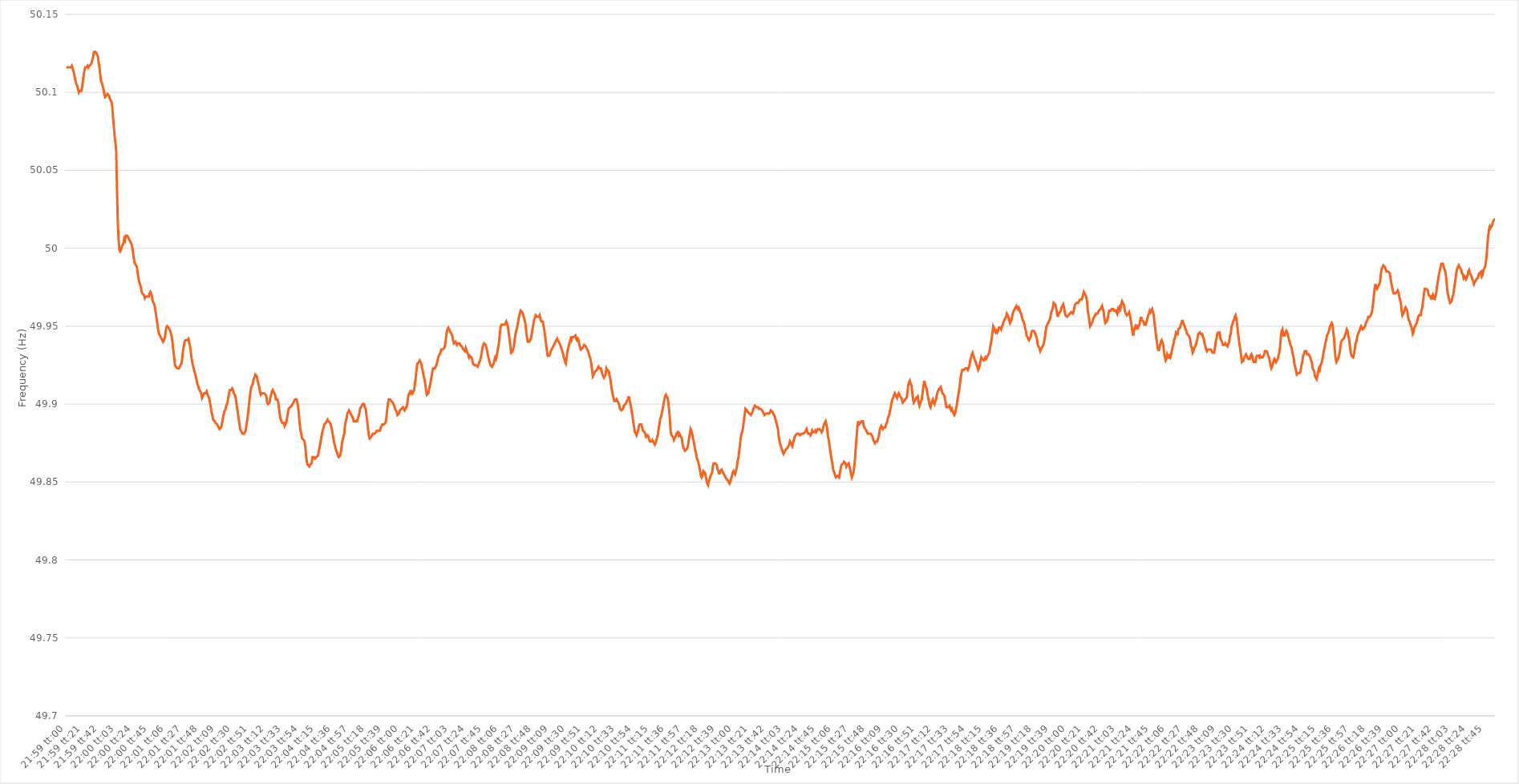
| Category | Series 0 |
|---|---|
| 0.9159722222222223 | 50.116 |
| 0.9159837962962962 | 50.116 |
| 0.9159953703703704 | 50.116 |
| 0.9160069444444444 | 50.116 |
| 0.9160185185185186 | 50.116 |
| 0.9160300925925925 | 50.116 |
| 0.9160416666666666 | 50.116 |
| 0.9160532407407408 | 50.117 |
| 0.9160648148148148 | 50.117 |
| 0.9160763888888889 | 50.114 |
| 0.9160879629629629 | 50.112 |
| 0.9160995370370371 | 50.109 |
| 0.9161111111111112 | 50.107 |
| 0.9161226851851851 | 50.105 |
| 0.9161342592592593 | 50.104 |
| 0.9161458333333333 | 50.102 |
| 0.9161574074074075 | 50.1 |
| 0.9161689814814814 | 50.101 |
| 0.9161805555555556 | 50.101 |
| 0.9161921296296297 | 50.101 |
| 0.9162037037037036 | 50.103 |
| 0.9162152777777778 | 50.107 |
| 0.9162268518518518 | 50.111 |
| 0.916238425925926 | 50.114 |
| 0.9162499999999999 | 50.116 |
| 0.916261574074074 | 50.116 |
| 0.9162731481481482 | 50.116 |
| 0.9162847222222222 | 50.117 |
| 0.9162962962962963 | 50.116 |
| 0.9163078703703703 | 50.117 |
| 0.9163194444444445 | 50.117 |
| 0.9163310185185186 | 50.118 |
| 0.9163425925925925 | 50.119 |
| 0.9163541666666667 | 50.121 |
| 0.9163657407407407 | 50.123 |
| 0.9163773148148149 | 50.126 |
| 0.9163888888888888 | 50.126 |
| 0.916400462962963 | 50.126 |
| 0.9164120370370371 | 50.126 |
| 0.916423611111111 | 50.124 |
| 0.9164351851851852 | 50.123 |
| 0.9164467592592592 | 50.119 |
| 0.9164583333333334 | 50.116 |
| 0.9164699074074073 | 50.111 |
| 0.9164814814814815 | 50.107 |
| 0.9164930555555556 | 50.106 |
| 0.9165046296296296 | 50.104 |
| 0.9165162037037037 | 50.102 |
| 0.9165277777777777 | 50.099 |
| 0.9165393518518519 | 50.097 |
| 0.916550925925926 | 50.097 |
| 0.9165625 | 50.098 |
| 0.9165740740740741 | 50.099 |
| 0.9165856481481481 | 50.099 |
| 0.9165972222222223 | 50.098 |
| 0.9166087962962962 | 50.096 |
| 0.9166203703703704 | 50.095 |
| 0.9166319444444445 | 50.094 |
| 0.9166435185185186 | 50.091 |
| 0.9166550925925926 | 50.084 |
| 0.9166666666666666 | 50.078 |
| 0.9166782407407408 | 50.072 |
| 0.9166898148148147 | 50.068 |
| 0.9167013888888889 | 50.062 |
| 0.916712962962963 | 50.037 |
| 0.916724537037037 | 50.017 |
| 0.9167361111111111 | 50.006 |
| 0.9167476851851851 | 49.999 |
| 0.9167592592592593 | 49.998 |
| 0.9167708333333334 | 49.999 |
| 0.9167824074074074 | 50.001 |
| 0.9167939814814815 | 50.002 |
| 0.9168055555555555 | 50.003 |
| 0.9168171296296297 | 50.006 |
| 0.9168287037037036 | 50.005 |
| 0.9168402777777778 | 50.008 |
| 0.9168518518518519 | 50.008 |
| 0.916863425925926 | 50.008 |
| 0.916875 | 50.007 |
| 0.916886574074074 | 50.007 |
| 0.9168981481481482 | 50.005 |
| 0.9169097222222221 | 50.004 |
| 0.9169212962962963 | 50.003 |
| 0.9169328703703704 | 50.001 |
| 0.9169444444444445 | 49.998 |
| 0.9169560185185185 | 49.994 |
| 0.9169675925925925 | 49.991 |
| 0.9169791666666667 | 49.99 |
| 0.9169907407407408 | 49.989 |
| 0.9170023148148148 | 49.988 |
| 0.9170138888888889 | 49.984 |
| 0.917025462962963 | 49.981 |
| 0.9170370370370371 | 49.978 |
| 0.917048611111111 | 49.977 |
| 0.9170601851851852 | 49.975 |
| 0.9170717592592593 | 49.972 |
| 0.9170833333333334 | 49.971 |
| 0.9170949074074074 | 49.971 |
| 0.9171064814814814 | 49.97 |
| 0.9171180555555556 | 49.968 |
| 0.9171296296296297 | 49.969 |
| 0.9171412037037037 | 49.969 |
| 0.9171527777777778 | 49.969 |
| 0.9171643518518519 | 49.969 |
| 0.9171759259259259 | 49.969 |
| 0.9171874999999999 | 49.971 |
| 0.9171990740740741 | 49.972 |
| 0.9172106481481482 | 49.971 |
| 0.9172222222222222 | 49.969 |
| 0.9172337962962963 | 49.966 |
| 0.9172453703703703 | 49.965 |
| 0.9172569444444445 | 49.964 |
| 0.9172685185185184 | 49.961 |
| 0.9172800925925926 | 49.958 |
| 0.9172916666666667 | 49.954 |
| 0.9173032407407408 | 49.951 |
| 0.9173148148148148 | 49.947 |
| 0.9173263888888888 | 49.945 |
| 0.917337962962963 | 49.944 |
| 0.9173495370370371 | 49.943 |
| 0.9173611111111111 | 49.943 |
| 0.9173726851851852 | 49.941 |
| 0.9173842592592593 | 49.94 |
| 0.9173958333333333 | 49.94 |
| 0.9174074074074073 | 49.942 |
| 0.9174189814814815 | 49.946 |
| 0.9174305555555556 | 49.949 |
| 0.9174421296296296 | 49.95 |
| 0.9174537037037037 | 49.95 |
| 0.9174652777777778 | 49.949 |
| 0.9174768518518519 | 49.948 |
| 0.9174884259259258 | 49.947 |
| 0.9175 | 49.945 |
| 0.9175115740740741 | 49.943 |
| 0.9175231481481482 | 49.939 |
| 0.9175347222222222 | 49.934 |
| 0.9175462962962962 | 49.93 |
| 0.9175578703703704 | 49.925 |
| 0.9175694444444445 | 49.924 |
| 0.9175810185185185 | 49.924 |
| 0.9175925925925926 | 49.923 |
| 0.9176041666666667 | 49.923 |
| 0.9176157407407407 | 49.923 |
| 0.9176273148148147 | 49.924 |
| 0.9176388888888889 | 49.924 |
| 0.917650462962963 | 49.926 |
| 0.917662037037037 | 49.929 |
| 0.9176736111111111 | 49.934 |
| 0.9176851851851852 | 49.937 |
| 0.9176967592592593 | 49.94 |
| 0.9177083333333332 | 49.941 |
| 0.9177199074074074 | 49.941 |
| 0.9177314814814815 | 49.941 |
| 0.9177430555555556 | 49.941 |
| 0.9177546296296296 | 49.942 |
| 0.9177662037037037 | 49.939 |
| 0.9177777777777778 | 49.937 |
| 0.917789351851852 | 49.933 |
| 0.9178009259259259 | 49.929 |
| 0.9178125 | 49.926 |
| 0.9178240740740741 | 49.924 |
| 0.9178356481481482 | 49.922 |
| 0.9178472222222221 | 49.92 |
| 0.9178587962962963 | 49.918 |
| 0.9178703703703704 | 49.916 |
| 0.9178819444444444 | 49.913 |
| 0.9178935185185185 | 49.912 |
| 0.9179050925925926 | 49.91 |
| 0.9179166666666667 | 49.909 |
| 0.9179282407407406 | 49.908 |
| 0.9179398148148148 | 49.907 |
| 0.9179513888888889 | 49.904 |
| 0.917962962962963 | 49.904 |
| 0.917974537037037 | 49.906 |
| 0.9179861111111111 | 49.907 |
| 0.9179976851851852 | 49.907 |
| 0.9180092592592594 | 49.907 |
| 0.9180208333333333 | 49.908 |
| 0.9180324074074074 | 49.906 |
| 0.9180439814814815 | 49.905 |
| 0.9180555555555556 | 49.904 |
| 0.9180671296296296 | 49.901 |
| 0.9180787037037037 | 49.898 |
| 0.9180902777777779 | 49.895 |
| 0.9181018518518518 | 49.893 |
| 0.9181134259259259 | 49.89 |
| 0.918125 | 49.89 |
| 0.9181365740740741 | 49.889 |
| 0.918148148148148 | 49.888 |
| 0.9181597222222222 | 49.888 |
| 0.9181712962962963 | 49.887 |
| 0.9181828703703704 | 49.886 |
| 0.9181944444444444 | 49.885 |
| 0.9182060185185185 | 49.884 |
| 0.9182175925925926 | 49.884 |
| 0.9182291666666668 | 49.885 |
| 0.9182407407407407 | 49.887 |
| 0.9182523148148148 | 49.89 |
| 0.9182638888888889 | 49.893 |
| 0.918275462962963 | 49.895 |
| 0.918287037037037 | 49.896 |
| 0.9182986111111111 | 49.898 |
| 0.9183101851851853 | 49.898 |
| 0.9183217592592593 | 49.901 |
| 0.9183333333333333 | 49.904 |
| 0.9183449074074074 | 49.907 |
| 0.9183564814814815 | 49.909 |
| 0.9183680555555555 | 49.909 |
| 0.9183796296296296 | 49.909 |
| 0.9183912037037038 | 49.91 |
| 0.9184027777777778 | 49.909 |
| 0.9184143518518518 | 49.907 |
| 0.9184259259259259 | 49.906 |
| 0.9184375 | 49.905 |
| 0.9184490740740742 | 49.902 |
| 0.9184606481481481 | 49.898 |
| 0.9184722222222222 | 49.895 |
| 0.9184837962962963 | 49.891 |
| 0.9184953703703704 | 49.888 |
| 0.9185069444444444 | 49.884 |
| 0.9185185185185185 | 49.883 |
| 0.9185300925925927 | 49.882 |
| 0.9185416666666667 | 49.881 |
| 0.9185532407407407 | 49.881 |
| 0.9185648148148148 | 49.881 |
| 0.9185763888888889 | 49.881 |
| 0.9185879629629629 | 49.883 |
| 0.918599537037037 | 49.887 |
| 0.9186111111111112 | 49.89 |
| 0.9186226851851852 | 49.894 |
| 0.9186342592592592 | 49.899 |
| 0.9186458333333333 | 49.904 |
| 0.9186574074074074 | 49.908 |
| 0.9186689814814816 | 49.911 |
| 0.9186805555555555 | 49.912 |
| 0.9186921296296297 | 49.913 |
| 0.9187037037037037 | 49.916 |
| 0.9187152777777778 | 49.917 |
| 0.9187268518518518 | 49.919 |
| 0.9187384259259259 | 49.919 |
| 0.9187500000000001 | 49.918 |
| 0.9187615740740741 | 49.915 |
| 0.9187731481481481 | 49.913 |
| 0.9187847222222222 | 49.911 |
| 0.9187962962962963 | 49.908 |
| 0.9188078703703703 | 49.906 |
| 0.9188194444444444 | 49.906 |
| 0.9188310185185186 | 49.907 |
| 0.9188425925925926 | 49.907 |
| 0.9188541666666666 | 49.907 |
| 0.9188657407407407 | 49.907 |
| 0.9188773148148148 | 49.906 |
| 0.918888888888889 | 49.905 |
| 0.9189004629629629 | 49.901 |
| 0.918912037037037 | 49.9 |
| 0.9189236111111111 | 49.9 |
| 0.9189351851851852 | 49.901 |
| 0.9189467592592592 | 49.904 |
| 0.9189583333333333 | 49.906 |
| 0.9189699074074075 | 49.908 |
| 0.9189814814814815 | 49.909 |
| 0.9189930555555555 | 49.908 |
| 0.9190046296296296 | 49.908 |
| 0.9190162037037037 | 49.906 |
| 0.9190277777777779 | 49.903 |
| 0.9190393518518518 | 49.903 |
| 0.919050925925926 | 49.903 |
| 0.9190625 | 49.901 |
| 0.919074074074074 | 49.897 |
| 0.9190856481481481 | 49.893 |
| 0.9190972222222222 | 49.89 |
| 0.9191087962962964 | 49.89 |
| 0.9191203703703703 | 49.888 |
| 0.9191319444444445 | 49.888 |
| 0.9191435185185185 | 49.888 |
| 0.9191550925925926 | 49.886 |
| 0.9191666666666666 | 49.886 |
| 0.9191782407407407 | 49.888 |
| 0.9191898148148149 | 49.891 |
| 0.9192013888888889 | 49.894 |
| 0.919212962962963 | 49.897 |
| 0.919224537037037 | 49.897 |
| 0.9192361111111111 | 49.898 |
| 0.9192476851851853 | 49.898 |
| 0.9192592592592592 | 49.899 |
| 0.9192708333333334 | 49.9 |
| 0.9192824074074074 | 49.901 |
| 0.9192939814814814 | 49.902 |
| 0.9193055555555555 | 49.903 |
| 0.9193171296296296 | 49.903 |
| 0.9193287037037038 | 49.903 |
| 0.9193402777777777 | 49.901 |
| 0.9193518518518519 | 49.898 |
| 0.9193634259259259 | 49.893 |
| 0.919375 | 49.887 |
| 0.919386574074074 | 49.883 |
| 0.9193981481481481 | 49.881 |
| 0.9194097222222223 | 49.878 |
| 0.9194212962962963 | 49.878 |
| 0.9194328703703704 | 49.877 |
| 0.9194444444444444 | 49.876 |
| 0.9194560185185185 | 49.873 |
| 0.9194675925925927 | 49.867 |
| 0.9194791666666666 | 49.863 |
| 0.9194907407407408 | 49.861 |
| 0.9195023148148148 | 49.861 |
| 0.9195138888888889 | 49.86 |
| 0.9195254629629629 | 49.861 |
| 0.919537037037037 | 49.861 |
| 0.9195486111111112 | 49.862 |
| 0.9195601851851851 | 49.866 |
| 0.9195717592592593 | 49.866 |
| 0.9195833333333333 | 49.866 |
| 0.9195949074074075 | 49.865 |
| 0.9196064814814814 | 49.865 |
| 0.9196180555555555 | 49.866 |
| 0.9196296296296297 | 49.866 |
| 0.9196412037037037 | 49.867 |
| 0.9196527777777778 | 49.87 |
| 0.9196643518518518 | 49.872 |
| 0.919675925925926 | 49.875 |
| 0.9196875000000001 | 49.878 |
| 0.919699074074074 | 49.881 |
| 0.9197106481481482 | 49.883 |
| 0.9197222222222222 | 49.885 |
| 0.9197337962962964 | 49.887 |
| 0.9197453703703703 | 49.887 |
| 0.9197569444444444 | 49.888 |
| 0.9197685185185186 | 49.889 |
| 0.9197800925925925 | 49.89 |
| 0.9197916666666667 | 49.889 |
| 0.9198032407407407 | 49.889 |
| 0.9198148148148149 | 49.888 |
| 0.9198263888888888 | 49.887 |
| 0.9198379629629629 | 49.885 |
| 0.9198495370370371 | 49.882 |
| 0.9198611111111111 | 49.879 |
| 0.9198726851851852 | 49.876 |
| 0.9198842592592592 | 49.874 |
| 0.9198958333333334 | 49.872 |
| 0.9199074074074075 | 49.87 |
| 0.9199189814814814 | 49.869 |
| 0.9199305555555556 | 49.867 |
| 0.9199421296296296 | 49.866 |
| 0.9199537037037038 | 49.866 |
| 0.9199652777777777 | 49.867 |
| 0.9199768518518519 | 49.87 |
| 0.919988425925926 | 49.874 |
| 0.9199999999999999 | 49.877 |
| 0.9200115740740741 | 49.879 |
| 0.9200231481481481 | 49.881 |
| 0.9200347222222223 | 49.886 |
| 0.9200462962962962 | 49.889 |
| 0.9200578703703703 | 49.891 |
| 0.9200694444444445 | 49.894 |
| 0.9200810185185185 | 49.895 |
| 0.9200925925925926 | 49.896 |
| 0.9201041666666666 | 49.896 |
| 0.9201157407407408 | 49.894 |
| 0.9201273148148149 | 49.893 |
| 0.9201388888888888 | 49.892 |
| 0.920150462962963 | 49.891 |
| 0.920162037037037 | 49.889 |
| 0.9201736111111112 | 49.889 |
| 0.9201851851851851 | 49.889 |
| 0.9201967592592593 | 49.889 |
| 0.9202083333333334 | 49.889 |
| 0.9202199074074073 | 49.889 |
| 0.9202314814814815 | 49.892 |
| 0.9202430555555555 | 49.894 |
| 0.9202546296296297 | 49.897 |
| 0.9202662037037036 | 49.898 |
| 0.9202777777777778 | 49.898 |
| 0.9202893518518519 | 49.9 |
| 0.9203009259259259 | 49.9 |
| 0.9203125 | 49.9 |
| 0.920324074074074 | 49.898 |
| 0.9203356481481482 | 49.897 |
| 0.9203472222222223 | 49.893 |
| 0.9203587962962962 | 49.889 |
| 0.9203703703703704 | 49.884 |
| 0.9203819444444444 | 49.88 |
| 0.9203935185185186 | 49.878 |
| 0.9204050925925925 | 49.878 |
| 0.9204166666666667 | 49.879 |
| 0.9204282407407408 | 49.88 |
| 0.9204398148148148 | 49.881 |
| 0.9204513888888889 | 49.881 |
| 0.9204629629629629 | 49.881 |
| 0.9204745370370371 | 49.881 |
| 0.920486111111111 | 49.882 |
| 0.9204976851851852 | 49.883 |
| 0.9205092592592593 | 49.883 |
| 0.9205208333333333 | 49.883 |
| 0.9205324074074074 | 49.883 |
| 0.9205439814814814 | 49.883 |
| 0.9205555555555556 | 49.885 |
| 0.9205671296296297 | 49.886 |
| 0.9205787037037036 | 49.887 |
| 0.9205902777777778 | 49.887 |
| 0.9206018518518518 | 49.887 |
| 0.920613425925926 | 49.887 |
| 0.9206249999999999 | 49.888 |
| 0.9206365740740741 | 49.891 |
| 0.9206481481481482 | 49.896 |
| 0.9206597222222223 | 49.9 |
| 0.9206712962962963 | 49.903 |
| 0.9206828703703703 | 49.903 |
| 0.9206944444444445 | 49.903 |
| 0.9207060185185184 | 49.902 |
| 0.9207175925925926 | 49.902 |
| 0.9207291666666667 | 49.901 |
| 0.9207407407407407 | 49.901 |
| 0.9207523148148148 | 49.899 |
| 0.9207638888888888 | 49.897 |
| 0.920775462962963 | 49.897 |
| 0.9207870370370371 | 49.895 |
| 0.920798611111111 | 49.893 |
| 0.9208101851851852 | 49.893 |
| 0.9208217592592592 | 49.894 |
| 0.9208333333333334 | 49.896 |
| 0.9208449074074073 | 49.896 |
| 0.9208564814814815 | 49.897 |
| 0.9208680555555556 | 49.897 |
| 0.9208796296296297 | 49.898 |
| 0.9208912037037037 | 49.897 |
| 0.9209027777777777 | 49.896 |
| 0.9209143518518519 | 49.897 |
| 0.920925925925926 | 49.897 |
| 0.9209375 | 49.899 |
| 0.9209490740740741 | 49.903 |
| 0.9209606481481482 | 49.906 |
| 0.9209722222222222 | 49.907 |
| 0.9209837962962962 | 49.908 |
| 0.9209953703703704 | 49.907 |
| 0.9210069444444445 | 49.908 |
| 0.9210185185185185 | 49.907 |
| 0.9210300925925926 | 49.908 |
| 0.9210416666666666 | 49.909 |
| 0.9210532407407408 | 49.913 |
| 0.9210648148148147 | 49.917 |
| 0.9210763888888889 | 49.922 |
| 0.921087962962963 | 49.926 |
| 0.9210995370370371 | 49.926 |
| 0.9211111111111111 | 49.927 |
| 0.9211226851851851 | 49.928 |
| 0.9211342592592593 | 49.927 |
| 0.9211458333333334 | 49.926 |
| 0.9211574074074074 | 49.923 |
| 0.9211689814814815 | 49.921 |
| 0.9211805555555556 | 49.918 |
| 0.9211921296296296 | 49.916 |
| 0.9212037037037036 | 49.913 |
| 0.9212152777777778 | 49.909 |
| 0.9212268518518519 | 49.906 |
| 0.9212384259259259 | 49.906 |
| 0.92125 | 49.907 |
| 0.921261574074074 | 49.91 |
| 0.9212731481481482 | 49.912 |
| 0.9212847222222221 | 49.915 |
| 0.9212962962962963 | 49.918 |
| 0.9213078703703704 | 49.921 |
| 0.9213194444444445 | 49.923 |
| 0.9213310185185185 | 49.923 |
| 0.9213425925925925 | 49.923 |
| 0.9213541666666667 | 49.924 |
| 0.9213657407407408 | 49.925 |
| 0.9213773148148148 | 49.927 |
| 0.9213888888888889 | 49.929 |
| 0.921400462962963 | 49.931 |
| 0.921412037037037 | 49.931 |
| 0.921423611111111 | 49.933 |
| 0.9214351851851852 | 49.935 |
| 0.9214467592592593 | 49.935 |
| 0.9214583333333333 | 49.935 |
| 0.9214699074074074 | 49.935 |
| 0.9214814814814815 | 49.936 |
| 0.9214930555555556 | 49.938 |
| 0.9215046296296295 | 49.942 |
| 0.9215162037037037 | 49.946 |
| 0.9215277777777778 | 49.948 |
| 0.9215393518518519 | 49.949 |
| 0.9215509259259259 | 49.948 |
| 0.9215625 | 49.947 |
| 0.9215740740740741 | 49.947 |
| 0.9215856481481483 | 49.945 |
| 0.9215972222222222 | 49.944 |
| 0.9216087962962963 | 49.941 |
| 0.9216203703703704 | 49.939 |
| 0.9216319444444445 | 49.939 |
| 0.9216435185185184 | 49.94 |
| 0.9216550925925926 | 49.939 |
| 0.9216666666666667 | 49.938 |
| 0.9216782407407407 | 49.939 |
| 0.9216898148148148 | 49.939 |
| 0.9217013888888889 | 49.939 |
| 0.921712962962963 | 49.938 |
| 0.9217245370370369 | 49.938 |
| 0.9217361111111111 | 49.937 |
| 0.9217476851851852 | 49.936 |
| 0.9217592592592593 | 49.935 |
| 0.9217708333333333 | 49.935 |
| 0.9217824074074074 | 49.934 |
| 0.9217939814814815 | 49.936 |
| 0.9218055555555557 | 49.936 |
| 0.9218171296296296 | 49.933 |
| 0.9218287037037037 | 49.932 |
| 0.9218402777777778 | 49.93 |
| 0.9218518518518519 | 49.931 |
| 0.9218634259259259 | 49.931 |
| 0.921875 | 49.93 |
| 0.9218865740740741 | 49.929 |
| 0.9218981481481481 | 49.926 |
| 0.9219097222222222 | 49.926 |
| 0.9219212962962963 | 49.925 |
| 0.9219328703703704 | 49.925 |
| 0.9219444444444443 | 49.925 |
| 0.9219560185185185 | 49.925 |
| 0.9219675925925926 | 49.924 |
| 0.9219791666666667 | 49.925 |
| 0.9219907407407407 | 49.927 |
| 0.9220023148148148 | 49.928 |
| 0.9220138888888889 | 49.93 |
| 0.9220254629629631 | 49.933 |
| 0.922037037037037 | 49.936 |
| 0.9220486111111111 | 49.938 |
| 0.9220601851851852 | 49.939 |
| 0.9220717592592593 | 49.939 |
| 0.9220833333333333 | 49.938 |
| 0.9220949074074074 | 49.936 |
| 0.9221064814814816 | 49.934 |
| 0.9221180555555555 | 49.931 |
| 0.9221296296296296 | 49.929 |
| 0.9221412037037037 | 49.927 |
| 0.9221527777777778 | 49.925 |
| 0.9221643518518517 | 49.925 |
| 0.9221759259259259 | 49.924 |
| 0.9221875 | 49.924 |
| 0.9221990740740741 | 49.926 |
| 0.9222106481481481 | 49.928 |
| 0.9222222222222222 | 49.93 |
| 0.9222337962962963 | 49.929 |
| 0.9222453703703705 | 49.931 |
| 0.9222569444444444 | 49.934 |
| 0.9222685185185185 | 49.937 |
| 0.9222800925925926 | 49.94 |
| 0.9222916666666667 | 49.946 |
| 0.9223032407407407 | 49.95 |
| 0.9223148148148148 | 49.951 |
| 0.922326388888889 | 49.951 |
| 0.922337962962963 | 49.951 |
| 0.922349537037037 | 49.951 |
| 0.9223611111111111 | 49.951 |
| 0.9223726851851852 | 49.952 |
| 0.9223842592592592 | 49.953 |
| 0.9223958333333333 | 49.953 |
| 0.9224074074074075 | 49.95 |
| 0.9224189814814815 | 49.946 |
| 0.9224305555555555 | 49.942 |
| 0.9224421296296296 | 49.938 |
| 0.9224537037037037 | 49.933 |
| 0.9224652777777779 | 49.933 |
| 0.9224768518518518 | 49.934 |
| 0.922488425925926 | 49.936 |
| 0.9225 | 49.939 |
| 0.9225115740740741 | 49.943 |
| 0.9225231481481481 | 49.946 |
| 0.9225347222222222 | 49.948 |
| 0.9225462962962964 | 49.95 |
| 0.9225578703703704 | 49.953 |
| 0.9225694444444444 | 49.956 |
| 0.9225810185185185 | 49.958 |
| 0.9225925925925926 | 49.96 |
| 0.9226041666666666 | 49.96 |
| 0.9226157407407407 | 49.959 |
| 0.9226273148148149 | 49.958 |
| 0.9226388888888889 | 49.956 |
| 0.9226504629629629 | 49.954 |
| 0.922662037037037 | 49.952 |
| 0.9226736111111111 | 49.947 |
| 0.9226851851851853 | 49.943 |
| 0.9226967592592592 | 49.94 |
| 0.9227083333333334 | 49.94 |
| 0.9227199074074074 | 49.94 |
| 0.9227314814814815 | 49.94 |
| 0.9227430555555555 | 49.942 |
| 0.9227546296296296 | 49.945 |
| 0.9227662037037038 | 49.948 |
| 0.9227777777777778 | 49.951 |
| 0.9227893518518518 | 49.954 |
| 0.9228009259259259 | 49.955 |
| 0.9228125 | 49.957 |
| 0.922824074074074 | 49.957 |
| 0.9228356481481481 | 49.956 |
| 0.9228472222222223 | 49.956 |
| 0.9228587962962963 | 49.956 |
| 0.9228703703703703 | 49.957 |
| 0.9228819444444444 | 49.955 |
| 0.9228935185185185 | 49.953 |
| 0.9229050925925927 | 49.953 |
| 0.9229166666666666 | 49.953 |
| 0.9229282407407408 | 49.95 |
| 0.9229398148148148 | 49.947 |
| 0.922951388888889 | 49.943 |
| 0.9229629629629629 | 49.939 |
| 0.922974537037037 | 49.935 |
| 0.9229861111111112 | 49.931 |
| 0.9229976851851852 | 49.931 |
| 0.9230092592592593 | 49.931 |
| 0.9230208333333333 | 49.932 |
| 0.9230324074074074 | 49.934 |
| 0.9230439814814816 | 49.934 |
| 0.9230555555555555 | 49.936 |
| 0.9230671296296297 | 49.937 |
| 0.9230787037037037 | 49.938 |
| 0.9230902777777777 | 49.939 |
| 0.9231018518518518 | 49.939 |
| 0.9231134259259259 | 49.941 |
| 0.9231250000000001 | 49.942 |
| 0.923136574074074 | 49.941 |
| 0.9231481481481482 | 49.94 |
| 0.9231597222222222 | 49.939 |
| 0.9231712962962964 | 49.938 |
| 0.9231828703703703 | 49.936 |
| 0.9231944444444444 | 49.935 |
| 0.9232060185185186 | 49.933 |
| 0.9232175925925926 | 49.931 |
| 0.9232291666666667 | 49.929 |
| 0.9232407407407407 | 49.927 |
| 0.9232523148148148 | 49.926 |
| 0.923263888888889 | 49.93 |
| 0.9232754629629629 | 49.934 |
| 0.9232870370370371 | 49.936 |
| 0.9232986111111111 | 49.938 |
| 0.9233101851851852 | 49.94 |
| 0.9233217592592592 | 49.942 |
| 0.9233333333333333 | 49.941 |
| 0.9233449074074075 | 49.943 |
| 0.9233564814814814 | 49.943 |
| 0.9233680555555556 | 49.943 |
| 0.9233796296296296 | 49.943 |
| 0.9233912037037038 | 49.944 |
| 0.9234027777777777 | 49.942 |
| 0.9234143518518518 | 49.941 |
| 0.923425925925926 | 49.942 |
| 0.9234375 | 49.941 |
| 0.9234490740740741 | 49.938 |
| 0.9234606481481481 | 49.936 |
| 0.9234722222222222 | 49.935 |
| 0.9234837962962964 | 49.935 |
| 0.9234953703703703 | 49.936 |
| 0.9235069444444445 | 49.936 |
| 0.9235185185185185 | 49.938 |
| 0.9235300925925927 | 49.938 |
| 0.9235416666666666 | 49.937 |
| 0.9235532407407407 | 49.937 |
| 0.9235648148148149 | 49.935 |
| 0.9235763888888888 | 49.934 |
| 0.923587962962963 | 49.932 |
| 0.923599537037037 | 49.932 |
| 0.9236111111111112 | 49.929 |
| 0.9236226851851851 | 49.926 |
| 0.9236342592592592 | 49.922 |
| 0.9236458333333334 | 49.918 |
| 0.9236574074074074 | 49.919 |
| 0.9236689814814815 | 49.919 |
| 0.9236805555555555 | 49.921 |
| 0.9236921296296297 | 49.921 |
| 0.9237037037037038 | 49.922 |
| 0.9237152777777777 | 49.923 |
| 0.9237268518518519 | 49.924 |
| 0.9237384259259259 | 49.923 |
| 0.9237500000000001 | 49.923 |
| 0.923761574074074 | 49.923 |
| 0.9237731481481481 | 49.921 |
| 0.9237847222222223 | 49.919 |
| 0.9237962962962962 | 49.918 |
| 0.9238078703703704 | 49.917 |
| 0.9238194444444444 | 49.918 |
| 0.9238310185185186 | 49.919 |
| 0.9238425925925925 | 49.923 |
| 0.9238541666666666 | 49.922 |
| 0.9238657407407408 | 49.922 |
| 0.9238773148148148 | 49.921 |
| 0.9238888888888889 | 49.918 |
| 0.9239004629629629 | 49.916 |
| 0.9239120370370371 | 49.912 |
| 0.9239236111111112 | 49.909 |
| 0.9239351851851851 | 49.906 |
| 0.9239467592592593 | 49.904 |
| 0.9239583333333333 | 49.902 |
| 0.9239699074074075 | 49.902 |
| 0.9239814814814814 | 49.902 |
| 0.9239930555555556 | 49.903 |
| 0.9240046296296297 | 49.903 |
| 0.9240162037037036 | 49.901 |
| 0.9240277777777778 | 49.9 |
| 0.9240393518518518 | 49.897 |
| 0.924050925925926 | 49.897 |
| 0.9240624999999999 | 49.896 |
| 0.924074074074074 | 49.896 |
| 0.9240856481481482 | 49.897 |
| 0.9240972222222222 | 49.899 |
| 0.9241087962962963 | 49.899 |
| 0.9241203703703703 | 49.9 |
| 0.9241319444444445 | 49.9 |
| 0.9241435185185186 | 49.902 |
| 0.9241550925925925 | 49.903 |
| 0.9241666666666667 | 49.905 |
| 0.9241782407407407 | 49.903 |
| 0.9241898148148149 | 49.901 |
| 0.9242013888888888 | 49.898 |
| 0.924212962962963 | 49.895 |
| 0.9242245370370371 | 49.892 |
| 0.9242361111111111 | 49.888 |
| 0.9242476851851852 | 49.885 |
| 0.9242592592592592 | 49.882 |
| 0.9242708333333334 | 49.881 |
| 0.9242824074074073 | 49.88 |
| 0.9242939814814815 | 49.88 |
| 0.9243055555555556 | 49.883 |
| 0.9243171296296296 | 49.886 |
| 0.9243287037037037 | 49.887 |
| 0.9243402777777777 | 49.887 |
| 0.9243518518518519 | 49.887 |
| 0.924363425925926 | 49.885 |
| 0.924375 | 49.883 |
| 0.9243865740740741 | 49.883 |
| 0.9243981481481481 | 49.882 |
| 0.9244097222222223 | 49.881 |
| 0.9244212962962962 | 49.879 |
| 0.9244328703703704 | 49.879 |
| 0.9244444444444445 | 49.88 |
| 0.9244560185185186 | 49.879 |
| 0.9244675925925926 | 49.877 |
| 0.9244791666666666 | 49.876 |
| 0.9244907407407408 | 49.876 |
| 0.9245023148148147 | 49.876 |
| 0.9245138888888889 | 49.877 |
| 0.924525462962963 | 49.876 |
| 0.924537037037037 | 49.875 |
| 0.9245486111111111 | 49.874 |
| 0.9245601851851851 | 49.875 |
| 0.9245717592592593 | 49.877 |
| 0.9245833333333334 | 49.879 |
| 0.9245949074074074 | 49.881 |
| 0.9246064814814815 | 49.885 |
| 0.9246180555555555 | 49.888 |
| 0.9246296296296297 | 49.891 |
| 0.9246412037037036 | 49.892 |
| 0.9246527777777778 | 49.895 |
| 0.9246643518518519 | 49.897 |
| 0.924675925925926 | 49.9 |
| 0.9246875 | 49.903 |
| 0.924699074074074 | 49.905 |
| 0.9247106481481482 | 49.906 |
| 0.9247222222222221 | 49.905 |
| 0.9247337962962963 | 49.904 |
| 0.9247453703703704 | 49.901 |
| 0.9247569444444445 | 49.896 |
| 0.9247685185185185 | 49.89 |
| 0.9247800925925925 | 49.882 |
| 0.9247916666666667 | 49.88 |
| 0.9248032407407408 | 49.88 |
| 0.9248148148148148 | 49.879 |
| 0.9248263888888889 | 49.877 |
| 0.924837962962963 | 49.877 |
| 0.9248495370370371 | 49.879 |
| 0.924861111111111 | 49.881 |
| 0.9248726851851852 | 49.881 |
| 0.9248842592592593 | 49.882 |
| 0.9248958333333334 | 49.88 |
| 0.9249074074074074 | 49.881 |
| 0.9249189814814814 | 49.88 |
| 0.9249305555555556 | 49.88 |
| 0.9249421296296297 | 49.878 |
| 0.9249537037037037 | 49.874 |
| 0.9249652777777778 | 49.872 |
| 0.9249768518518519 | 49.871 |
| 0.9249884259259259 | 49.87 |
| 0.9249999999999999 | 49.87 |
| 0.9250115740740741 | 49.871 |
| 0.9250231481481482 | 49.872 |
| 0.9250347222222222 | 49.874 |
| 0.9250462962962963 | 49.878 |
| 0.9250578703703703 | 49.881 |
| 0.9250694444444445 | 49.884 |
| 0.9250810185185184 | 49.883 |
| 0.9250925925925926 | 49.881 |
| 0.9251041666666667 | 49.878 |
| 0.9251157407407408 | 49.876 |
| 0.9251273148148148 | 49.873 |
| 0.9251388888888888 | 49.87 |
| 0.925150462962963 | 49.868 |
| 0.9251620370370371 | 49.865 |
| 0.9251736111111111 | 49.864 |
| 0.9251851851851852 | 49.862 |
| 0.9251967592592593 | 49.86 |
| 0.9252083333333333 | 49.857 |
| 0.9252199074074073 | 49.854 |
| 0.9252314814814815 | 49.853 |
| 0.9252430555555556 | 49.854 |
| 0.9252546296296296 | 49.857 |
| 0.9252662037037037 | 49.857 |
| 0.9252777777777778 | 49.856 |
| 0.9252893518518519 | 49.854 |
| 0.9253009259259258 | 49.851 |
| 0.9253125 | 49.849 |
| 0.9253240740740741 | 49.848 |
| 0.9253356481481482 | 49.851 |
| 0.9253472222222222 | 49.852 |
| 0.9253587962962962 | 49.854 |
| 0.9253703703703704 | 49.855 |
| 0.9253819444444445 | 49.856 |
| 0.9253935185185185 | 49.86 |
| 0.9254050925925926 | 49.862 |
| 0.9254166666666667 | 49.862 |
| 0.9254282407407407 | 49.862 |
| 0.9254398148148147 | 49.862 |
| 0.9254513888888889 | 49.861 |
| 0.925462962962963 | 49.858 |
| 0.925474537037037 | 49.857 |
| 0.9254861111111111 | 49.855 |
| 0.9254976851851852 | 49.857 |
| 0.9255092592592593 | 49.857 |
| 0.9255208333333332 | 49.858 |
| 0.9255324074074074 | 49.857 |
| 0.9255439814814815 | 49.857 |
| 0.9255555555555556 | 49.855 |
| 0.9255671296296296 | 49.854 |
| 0.9255787037037037 | 49.853 |
| 0.9255902777777778 | 49.852 |
| 0.925601851851852 | 49.852 |
| 0.9256134259259259 | 49.851 |
| 0.925625 | 49.851 |
| 0.9256365740740741 | 49.849 |
| 0.9256481481481482 | 49.85 |
| 0.9256597222222221 | 49.852 |
| 0.9256712962962963 | 49.854 |
| 0.9256828703703704 | 49.856 |
| 0.9256944444444444 | 49.857 |
| 0.9257060185185185 | 49.856 |
| 0.9257175925925926 | 49.855 |
| 0.9257291666666667 | 49.857 |
| 0.9257407407407406 | 49.859 |
| 0.9257523148148148 | 49.863 |
| 0.9257638888888889 | 49.865 |
| 0.925775462962963 | 49.869 |
| 0.925787037037037 | 49.873 |
| 0.9257986111111111 | 49.878 |
| 0.9258101851851852 | 49.881 |
| 0.9258217592592594 | 49.882 |
| 0.9258333333333333 | 49.885 |
| 0.9258449074074074 | 49.889 |
| 0.9258564814814815 | 49.893 |
| 0.9258680555555556 | 49.897 |
| 0.9258796296296296 | 49.897 |
| 0.9258912037037037 | 49.896 |
| 0.9259027777777779 | 49.895 |
| 0.9259143518518518 | 49.895 |
| 0.9259259259259259 | 49.894 |
| 0.9259375 | 49.894 |
| 0.9259490740740741 | 49.893 |
| 0.925960648148148 | 49.894 |
| 0.9259722222222222 | 49.895 |
| 0.9259837962962963 | 49.897 |
| 0.9259953703703704 | 49.898 |
| 0.9260069444444444 | 49.899 |
| 0.9260185185185185 | 49.899 |
| 0.9260300925925926 | 49.898 |
| 0.9260416666666668 | 49.898 |
| 0.9260532407407407 | 49.898 |
| 0.9260648148148148 | 49.897 |
| 0.9260763888888889 | 49.897 |
| 0.926087962962963 | 49.897 |
| 0.926099537037037 | 49.897 |
| 0.9261111111111111 | 49.896 |
| 0.9261226851851853 | 49.895 |
| 0.9261342592592593 | 49.894 |
| 0.9261458333333333 | 49.893 |
| 0.9261574074074074 | 49.893 |
| 0.9261689814814815 | 49.894 |
| 0.9261805555555555 | 49.894 |
| 0.9261921296296296 | 49.894 |
| 0.9262037037037038 | 49.894 |
| 0.9262152777777778 | 49.894 |
| 0.9262268518518518 | 49.895 |
| 0.9262384259259259 | 49.896 |
| 0.92625 | 49.896 |
| 0.9262615740740742 | 49.895 |
| 0.9262731481481481 | 49.894 |
| 0.9262847222222222 | 49.894 |
| 0.9262962962962963 | 49.892 |
| 0.9263078703703704 | 49.89 |
| 0.9263194444444444 | 49.888 |
| 0.9263310185185185 | 49.886 |
| 0.9263425925925927 | 49.884 |
| 0.9263541666666667 | 49.879 |
| 0.9263657407407407 | 49.876 |
| 0.9263773148148148 | 49.874 |
| 0.9263888888888889 | 49.874 |
| 0.9264004629629629 | 49.871 |
| 0.926412037037037 | 49.869 |
| 0.9264236111111112 | 49.868 |
| 0.9264351851851852 | 49.869 |
| 0.9264467592592592 | 49.87 |
| 0.9264583333333333 | 49.871 |
| 0.9264699074074074 | 49.871 |
| 0.9264814814814816 | 49.872 |
| 0.9264930555555555 | 49.873 |
| 0.9265046296296297 | 49.874 |
| 0.9265162037037037 | 49.876 |
| 0.9265277777777778 | 49.875 |
| 0.9265393518518518 | 49.874 |
| 0.9265509259259259 | 49.873 |
| 0.9265625000000001 | 49.875 |
| 0.9265740740740741 | 49.877 |
| 0.9265856481481481 | 49.879 |
| 0.9265972222222222 | 49.88 |
| 0.9266087962962963 | 49.88 |
| 0.9266203703703703 | 49.881 |
| 0.9266319444444444 | 49.881 |
| 0.9266435185185186 | 49.881 |
| 0.9266550925925926 | 49.881 |
| 0.9266666666666666 | 49.88 |
| 0.9266782407407407 | 49.88 |
| 0.9266898148148148 | 49.881 |
| 0.926701388888889 | 49.881 |
| 0.9267129629629629 | 49.881 |
| 0.926724537037037 | 49.881 |
| 0.9267361111111111 | 49.882 |
| 0.9267476851851852 | 49.883 |
| 0.9267592592592592 | 49.884 |
| 0.9267708333333333 | 49.882 |
| 0.9267824074074075 | 49.881 |
| 0.9267939814814815 | 49.881 |
| 0.9268055555555555 | 49.881 |
| 0.9268171296296296 | 49.88 |
| 0.9268287037037037 | 49.881 |
| 0.9268402777777779 | 49.883 |
| 0.9268518518518518 | 49.882 |
| 0.926863425925926 | 49.882 |
| 0.926875 | 49.882 |
| 0.926886574074074 | 49.883 |
| 0.9268981481481481 | 49.882 |
| 0.9269097222222222 | 49.883 |
| 0.9269212962962964 | 49.884 |
| 0.9269328703703703 | 49.884 |
| 0.9269444444444445 | 49.884 |
| 0.9269560185185185 | 49.884 |
| 0.9269675925925926 | 49.883 |
| 0.9269791666666666 | 49.882 |
| 0.9269907407407407 | 49.883 |
| 0.9270023148148149 | 49.885 |
| 0.9270138888888889 | 49.887 |
| 0.927025462962963 | 49.888 |
| 0.927037037037037 | 49.889 |
| 0.9270486111111111 | 49.887 |
| 0.9270601851851853 | 49.884 |
| 0.9270717592592592 | 49.879 |
| 0.9270833333333334 | 49.877 |
| 0.9270949074074074 | 49.873 |
| 0.9271064814814814 | 49.869 |
| 0.9271180555555555 | 49.866 |
| 0.9271296296296296 | 49.863 |
| 0.9271412037037038 | 49.86 |
| 0.9271527777777777 | 49.857 |
| 0.9271643518518519 | 49.856 |
| 0.9271759259259259 | 49.854 |
| 0.9271875 | 49.853 |
| 0.927199074074074 | 49.853 |
| 0.9272106481481481 | 49.854 |
| 0.9272222222222223 | 49.854 |
| 0.9272337962962963 | 49.853 |
| 0.9272453703703704 | 49.856 |
| 0.9272569444444444 | 49.859 |
| 0.9272685185185185 | 49.861 |
| 0.9272800925925927 | 49.861 |
| 0.9272916666666666 | 49.862 |
| 0.9273032407407408 | 49.863 |
| 0.9273148148148148 | 49.863 |
| 0.9273263888888889 | 49.862 |
| 0.9273379629629629 | 49.86 |
| 0.927349537037037 | 49.861 |
| 0.9273611111111112 | 49.861 |
| 0.9273726851851851 | 49.862 |
| 0.9273842592592593 | 49.86 |
| 0.9273958333333333 | 49.858 |
| 0.9274074074074075 | 49.855 |
| 0.9274189814814814 | 49.853 |
| 0.9274305555555555 | 49.853 |
| 0.9274421296296297 | 49.856 |
| 0.9274537037037037 | 49.86 |
| 0.9274652777777778 | 49.865 |
| 0.9274768518518518 | 49.873 |
| 0.927488425925926 | 49.879 |
| 0.9275000000000001 | 49.886 |
| 0.927511574074074 | 49.889 |
| 0.9275231481481482 | 49.887 |
| 0.9275347222222222 | 49.887 |
| 0.9275462962962964 | 49.888 |
| 0.9275578703703703 | 49.889 |
| 0.9275694444444444 | 49.889 |
| 0.9275810185185186 | 49.889 |
| 0.9275925925925925 | 49.886 |
| 0.9276041666666667 | 49.885 |
| 0.9276157407407407 | 49.885 |
| 0.9276273148148149 | 49.883 |
| 0.9276388888888888 | 49.882 |
| 0.9276504629629629 | 49.881 |
| 0.9276620370370371 | 49.881 |
| 0.9276736111111111 | 49.881 |
| 0.9276851851851852 | 49.881 |
| 0.9276967592592592 | 49.881 |
| 0.9277083333333334 | 49.88 |
| 0.9277199074074075 | 49.879 |
| 0.9277314814814814 | 49.877 |
| 0.9277430555555556 | 49.877 |
| 0.9277546296296296 | 49.875 |
| 0.9277662037037038 | 49.876 |
| 0.9277777777777777 | 49.876 |
| 0.9277893518518519 | 49.876 |
| 0.927800925925926 | 49.878 |
| 0.9278124999999999 | 49.88 |
| 0.9278240740740741 | 49.883 |
| 0.9278356481481481 | 49.885 |
| 0.9278472222222223 | 49.886 |
| 0.9278587962962962 | 49.885 |
| 0.9278703703703703 | 49.884 |
| 0.9278819444444445 | 49.885 |
| 0.9278935185185185 | 49.885 |
| 0.9279050925925926 | 49.885 |
| 0.9279166666666666 | 49.887 |
| 0.9279282407407408 | 49.888 |
| 0.9279398148148149 | 49.89 |
| 0.9279513888888888 | 49.892 |
| 0.927962962962963 | 49.893 |
| 0.927974537037037 | 49.896 |
| 0.9279861111111112 | 49.898 |
| 0.9279976851851851 | 49.901 |
| 0.9280092592592593 | 49.903 |
| 0.9280208333333334 | 49.904 |
| 0.9280324074074073 | 49.904 |
| 0.9280439814814815 | 49.907 |
| 0.9280555555555555 | 49.906 |
| 0.9280671296296297 | 49.905 |
| 0.9280787037037036 | 49.904 |
| 0.9280902777777778 | 49.906 |
| 0.9281018518518519 | 49.907 |
| 0.9281134259259259 | 49.906 |
| 0.928125 | 49.906 |
| 0.928136574074074 | 49.904 |
| 0.9281481481481482 | 49.903 |
| 0.9281597222222223 | 49.901 |
| 0.9281712962962962 | 49.901 |
| 0.9281828703703704 | 49.902 |
| 0.9281944444444444 | 49.903 |
| 0.9282060185185186 | 49.903 |
| 0.9282175925925925 | 49.904 |
| 0.9282291666666667 | 49.908 |
| 0.9282407407407408 | 49.912 |
| 0.9282523148148148 | 49.914 |
| 0.9282638888888889 | 49.915 |
| 0.9282754629629629 | 49.913 |
| 0.9282870370370371 | 49.912 |
| 0.928298611111111 | 49.908 |
| 0.9283101851851852 | 49.903 |
| 0.9283217592592593 | 49.901 |
| 0.9283333333333333 | 49.902 |
| 0.9283449074074074 | 49.902 |
| 0.9283564814814814 | 49.904 |
| 0.9283680555555556 | 49.904 |
| 0.9283796296296297 | 49.905 |
| 0.9283912037037036 | 49.901 |
| 0.9284027777777778 | 49.899 |
| 0.9284143518518518 | 49.899 |
| 0.928425925925926 | 49.902 |
| 0.9284374999999999 | 49.903 |
| 0.9284490740740741 | 49.907 |
| 0.9284606481481482 | 49.911 |
| 0.9284722222222223 | 49.915 |
| 0.9284837962962963 | 49.913 |
| 0.9284953703703703 | 49.913 |
| 0.9285069444444445 | 49.91 |
| 0.9285185185185184 | 49.907 |
| 0.9285300925925926 | 49.904 |
| 0.9285416666666667 | 49.902 |
| 0.9285532407407407 | 49.899 |
| 0.9285648148148148 | 49.898 |
| 0.9285763888888888 | 49.9 |
| 0.928587962962963 | 49.902 |
| 0.9285995370370371 | 49.903 |
| 0.928611111111111 | 49.901 |
| 0.9286226851851852 | 49.9 |
| 0.9286342592592592 | 49.902 |
| 0.9286458333333334 | 49.903 |
| 0.9286574074074073 | 49.906 |
| 0.9286689814814815 | 49.908 |
| 0.9286805555555556 | 49.909 |
| 0.9286921296296297 | 49.91 |
| 0.9287037037037037 | 49.91 |
| 0.9287152777777777 | 49.911 |
| 0.9287268518518519 | 49.909 |
| 0.928738425925926 | 49.907 |
| 0.92875 | 49.907 |
| 0.9287615740740741 | 49.906 |
| 0.9287731481481482 | 49.904 |
| 0.9287847222222222 | 49.901 |
| 0.9287962962962962 | 49.898 |
| 0.9288078703703704 | 49.898 |
| 0.9288194444444445 | 49.898 |
| 0.9288310185185185 | 49.898 |
| 0.9288425925925926 | 49.899 |
| 0.9288541666666666 | 49.897 |
| 0.9288657407407408 | 49.896 |
| 0.9288773148148147 | 49.897 |
| 0.9288888888888889 | 49.897 |
| 0.928900462962963 | 49.894 |
| 0.9289120370370371 | 49.893 |
| 0.9289236111111111 | 49.894 |
| 0.9289351851851851 | 49.897 |
| 0.9289467592592593 | 49.899 |
| 0.9289583333333334 | 49.903 |
| 0.9289699074074074 | 49.906 |
| 0.9289814814814815 | 49.909 |
| 0.9289930555555556 | 49.913 |
| 0.9290046296296296 | 49.917 |
| 0.9290162037037036 | 49.92 |
| 0.9290277777777778 | 49.922 |
| 0.9290393518518519 | 49.922 |
| 0.9290509259259259 | 49.922 |
| 0.9290625 | 49.922 |
| 0.929074074074074 | 49.923 |
| 0.9290856481481482 | 49.923 |
| 0.9290972222222221 | 49.923 |
| 0.9291087962962963 | 49.922 |
| 0.9291203703703704 | 49.923 |
| 0.9291319444444445 | 49.925 |
| 0.9291435185185185 | 49.928 |
| 0.9291550925925925 | 49.93 |
| 0.9291666666666667 | 49.932 |
| 0.9291782407407408 | 49.933 |
| 0.9291898148148148 | 49.931 |
| 0.9292013888888889 | 49.931 |
| 0.929212962962963 | 49.928 |
| 0.929224537037037 | 49.927 |
| 0.929236111111111 | 49.925 |
| 0.9292476851851852 | 49.924 |
| 0.9292592592592593 | 49.922 |
| 0.9292708333333333 | 49.923 |
| 0.9292824074074074 | 49.925 |
| 0.9292939814814815 | 49.928 |
| 0.9293055555555556 | 49.93 |
| 0.9293171296296295 | 49.929 |
| 0.9293287037037037 | 49.929 |
| 0.9293402777777778 | 49.928 |
| 0.9293518518518519 | 49.929 |
| 0.9293634259259259 | 49.93 |
| 0.929375 | 49.929 |
| 0.9293865740740741 | 49.93 |
| 0.9293981481481483 | 49.931 |
| 0.9294097222222222 | 49.932 |
| 0.9294212962962963 | 49.933 |
| 0.9294328703703704 | 49.936 |
| 0.9294444444444444 | 49.939 |
| 0.9294560185185184 | 49.942 |
| 0.9294675925925926 | 49.946 |
| 0.9294791666666667 | 49.95 |
| 0.9294907407407407 | 49.949 |
| 0.9295023148148148 | 49.947 |
| 0.9295138888888889 | 49.946 |
| 0.929525462962963 | 49.947 |
| 0.9295370370370369 | 49.946 |
| 0.9295486111111111 | 49.947 |
| 0.9295601851851852 | 49.949 |
| 0.9295717592592593 | 49.949 |
| 0.9295833333333333 | 49.949 |
| 0.9295949074074074 | 49.948 |
| 0.9296064814814815 | 49.95 |
| 0.9296180555555557 | 49.951 |
| 0.9296296296296296 | 49.953 |
| 0.9296412037037037 | 49.954 |
| 0.9296527777777778 | 49.954 |
| 0.9296643518518519 | 49.956 |
| 0.9296759259259259 | 49.958 |
| 0.9296875 | 49.958 |
| 0.9296990740740741 | 49.956 |
| 0.9297106481481481 | 49.954 |
| 0.9297222222222222 | 49.952 |
| 0.9297337962962963 | 49.952 |
| 0.9297453703703704 | 49.954 |
| 0.9297569444444443 | 49.957 |
| 0.9297685185185185 | 49.959 |
| 0.9297800925925926 | 49.96 |
| 0.9297916666666667 | 49.961 |
| 0.9298032407407407 | 49.961 |
| 0.9298148148148148 | 49.963 |
| 0.9298263888888889 | 49.962 |
| 0.9298379629629631 | 49.961 |
| 0.929849537037037 | 49.962 |
| 0.9298611111111111 | 49.961 |
| 0.9298726851851852 | 49.959 |
| 0.9298842592592593 | 49.958 |
| 0.9298958333333333 | 49.956 |
| 0.9299074074074074 | 49.954 |
| 0.9299189814814816 | 49.953 |
| 0.9299305555555556 | 49.952 |
| 0.9299421296296296 | 49.949 |
| 0.9299537037037037 | 49.947 |
| 0.9299652777777778 | 49.944 |
| 0.9299768518518517 | 49.943 |
| 0.9299884259259259 | 49.942 |
| 0.93 | 49.941 |
| 0.9300115740740741 | 49.942 |
| 0.9300231481481481 | 49.943 |
| 0.9300347222222222 | 49.946 |
| 0.9300462962962963 | 49.947 |
| 0.9300578703703705 | 49.947 |
| 0.9300694444444444 | 49.947 |
| 0.9300810185185185 | 49.946 |
| 0.9300925925925926 | 49.945 |
| 0.9301041666666667 | 49.945 |
| 0.9301157407407407 | 49.942 |
| 0.9301273148148148 | 49.938 |
| 0.930138888888889 | 49.937 |
| 0.930150462962963 | 49.936 |
| 0.930162037037037 | 49.934 |
| 0.9301736111111111 | 49.934 |
| 0.9301851851851852 | 49.936 |
| 0.9301967592592592 | 49.937 |
| 0.9302083333333333 | 49.938 |
| 0.9302199074074075 | 49.94 |
| 0.9302314814814815 | 49.943 |
| 0.9302430555555555 | 49.947 |
| 0.9302546296296296 | 49.95 |
| 0.9302662037037037 | 49.951 |
| 0.9302777777777779 | 49.952 |
| 0.9302893518518518 | 49.953 |
| 0.930300925925926 | 49.954 |
| 0.9303125 | 49.956 |
| 0.9303240740740741 | 49.959 |
| 0.9303356481481481 | 49.96 |
| 0.9303472222222222 | 49.962 |
| 0.9303587962962964 | 49.965 |
| 0.9303703703703704 | 49.965 |
| 0.9303819444444444 | 49.964 |
| 0.9303935185185185 | 49.962 |
| 0.9304050925925926 | 49.959 |
| 0.9304166666666666 | 49.956 |
| 0.9304282407407407 | 49.958 |
| 0.9304398148148149 | 49.958 |
| 0.9304513888888889 | 49.959 |
| 0.9304629629629629 | 49.96 |
| 0.930474537037037 | 49.962 |
| 0.9304861111111111 | 49.963 |
| 0.9304976851851853 | 49.964 |
| 0.9305092592592592 | 49.962 |
| 0.9305208333333334 | 49.959 |
| 0.9305324074074074 | 49.957 |
| 0.9305439814814815 | 49.957 |
| 0.9305555555555555 | 49.956 |
| 0.9305671296296296 | 49.956 |
| 0.9305787037037038 | 49.957 |
| 0.9305902777777778 | 49.958 |
| 0.9306018518518518 | 49.958 |
| 0.9306134259259259 | 49.959 |
| 0.930625 | 49.959 |
| 0.930636574074074 | 49.958 |
| 0.9306481481481481 | 49.959 |
| 0.9306597222222223 | 49.962 |
| 0.9306712962962963 | 49.964 |
| 0.9306828703703703 | 49.964 |
| 0.9306944444444444 | 49.965 |
| 0.9307060185185185 | 49.965 |
| 0.9307175925925927 | 49.965 |
| 0.9307291666666666 | 49.966 |
| 0.9307407407407408 | 49.967 |
| 0.9307523148148148 | 49.967 |
| 0.930763888888889 | 49.967 |
| 0.9307754629629629 | 49.968 |
| 0.930787037037037 | 49.97 |
| 0.9307986111111112 | 49.972 |
| 0.9308101851851852 | 49.971 |
| 0.9308217592592593 | 49.971 |
| 0.9308333333333333 | 49.969 |
| 0.9308449074074074 | 49.966 |
| 0.9308564814814816 | 49.96 |
| 0.9308680555555555 | 49.957 |
| 0.9308796296296297 | 49.953 |
| 0.9308912037037037 | 49.95 |
| 0.9309027777777777 | 49.95 |
| 0.9309143518518518 | 49.952 |
| 0.9309259259259259 | 49.953 |
| 0.9309375000000001 | 49.955 |
| 0.930949074074074 | 49.955 |
| 0.9309606481481482 | 49.957 |
| 0.9309722222222222 | 49.958 |
| 0.9309837962962964 | 49.958 |
| 0.9309953703703703 | 49.958 |
| 0.9310069444444444 | 49.958 |
| 0.9310185185185186 | 49.96 |
| 0.9310300925925926 | 49.96 |
| 0.9310416666666667 | 49.961 |
| 0.9310532407407407 | 49.962 |
| 0.9310648148148148 | 49.963 |
| 0.931076388888889 | 49.961 |
| 0.9310879629629629 | 49.959 |
| 0.9310995370370371 | 49.955 |
| 0.9311111111111111 | 49.952 |
| 0.9311226851851852 | 49.952 |
| 0.9311342592592592 | 49.953 |
| 0.9311458333333333 | 49.955 |
| 0.9311574074074075 | 49.958 |
| 0.9311689814814814 | 49.96 |
| 0.9311805555555556 | 49.96 |
| 0.9311921296296296 | 49.96 |
| 0.9312037037037038 | 49.961 |
| 0.9312152777777777 | 49.961 |
| 0.9312268518518518 | 49.961 |
| 0.931238425925926 | 49.96 |
| 0.93125 | 49.96 |
| 0.9312615740740741 | 49.96 |
| 0.9312731481481481 | 49.959 |
| 0.9312847222222222 | 49.958 |
| 0.9312962962962964 | 49.961 |
| 0.9313078703703703 | 49.96 |
| 0.9313194444444445 | 49.962 |
| 0.9313310185185185 | 49.961 |
| 0.9313425925925927 | 49.964 |
| 0.9313541666666666 | 49.966 |
| 0.9313657407407407 | 49.966 |
| 0.9313773148148149 | 49.964 |
| 0.9313888888888888 | 49.962 |
| 0.931400462962963 | 49.959 |
| 0.931412037037037 | 49.958 |
| 0.9314236111111112 | 49.957 |
| 0.9314351851851851 | 49.957 |
| 0.9314467592592592 | 49.958 |
| 0.9314583333333334 | 49.959 |
| 0.9314699074074074 | 49.957 |
| 0.9314814814814815 | 49.954 |
| 0.9314930555555555 | 49.951 |
| 0.9315046296296297 | 49.947 |
| 0.9315162037037038 | 49.944 |
| 0.9315277777777777 | 49.947 |
| 0.9315393518518519 | 49.947 |
| 0.9315509259259259 | 49.95 |
| 0.9315625000000001 | 49.949 |
| 0.931574074074074 | 49.95 |
| 0.9315856481481481 | 49.949 |
| 0.9315972222222223 | 49.95 |
| 0.9316087962962962 | 49.951 |
| 0.9316203703703704 | 49.954 |
| 0.9316319444444444 | 49.956 |
| 0.9316435185185186 | 49.954 |
| 0.9316550925925925 | 49.954 |
| 0.9316666666666666 | 49.953 |
| 0.9316782407407408 | 49.951 |
| 0.9316898148148148 | 49.951 |
| 0.9317013888888889 | 49.951 |
| 0.9317129629629629 | 49.953 |
| 0.9317245370370371 | 49.955 |
| 0.9317361111111112 | 49.957 |
| 0.9317476851851851 | 49.958 |
| 0.9317592592592593 | 49.96 |
| 0.9317708333333333 | 49.959 |
| 0.9317824074074075 | 49.96 |
| 0.9317939814814814 | 49.961 |
| 0.9318055555555556 | 49.959 |
| 0.9318171296296297 | 49.957 |
| 0.9318287037037036 | 49.952 |
| 0.9318402777777778 | 49.948 |
| 0.9318518518518518 | 49.943 |
| 0.931863425925926 | 49.94 |
| 0.9318749999999999 | 49.936 |
| 0.931886574074074 | 49.934 |
| 0.9318981481481482 | 49.936 |
| 0.9319097222222222 | 49.938 |
| 0.9319212962962963 | 49.94 |
| 0.9319328703703703 | 49.941 |
| 0.9319444444444445 | 49.941 |
| 0.9319560185185186 | 49.938 |
| 0.9319675925925925 | 49.933 |
| 0.9319791666666667 | 49.93 |
| 0.9319907407407407 | 49.928 |
| 0.9320023148148149 | 49.929 |
| 0.9320138888888888 | 49.932 |
| 0.932025462962963 | 49.932 |
| 0.9320370370370371 | 49.93 |
| 0.932048611111111 | 49.931 |
| 0.9320601851851852 | 49.93 |
| 0.9320717592592592 | 49.932 |
| 0.9320833333333334 | 49.935 |
| 0.9320949074074073 | 49.937 |
| 0.9321064814814815 | 49.939 |
| 0.9321180555555556 | 49.942 |
| 0.9321296296296296 | 49.943 |
| 0.9321412037037037 | 49.946 |
| 0.9321527777777777 | 49.946 |
| 0.9321643518518519 | 49.945 |
| 0.932175925925926 | 49.948 |
| 0.9321875 | 49.948 |
| 0.9321990740740741 | 49.949 |
| 0.9322106481481481 | 49.951 |
| 0.9322222222222223 | 49.952 |
| 0.9322337962962962 | 49.954 |
| 0.9322453703703704 | 49.952 |
| 0.9322569444444445 | 49.952 |
| 0.9322685185185186 | 49.95 |
| 0.9322800925925926 | 49.948 |
| 0.9322916666666666 | 49.947 |
| 0.9323032407407408 | 49.945 |
| 0.9323148148148147 | 49.945 |
| 0.9323263888888889 | 49.944 |
| 0.932337962962963 | 49.943 |
| 0.932349537037037 | 49.941 |
| 0.9323611111111111 | 49.937 |
| 0.9323726851851851 | 49.936 |
| 0.9323842592592593 | 49.933 |
| 0.9323958333333334 | 49.934 |
| 0.9324074074074074 | 49.936 |
| 0.9324189814814815 | 49.937 |
| 0.9324305555555555 | 49.938 |
| 0.9324421296296297 | 49.94 |
| 0.9324537037037036 | 49.942 |
| 0.9324652777777778 | 49.945 |
| 0.9324768518518519 | 49.945 |
| 0.932488425925926 | 49.946 |
| 0.9325 | 49.945 |
| 0.932511574074074 | 49.945 |
| 0.9325231481481482 | 49.945 |
| 0.9325347222222223 | 49.943 |
| 0.9325462962962963 | 49.942 |
| 0.9325578703703704 | 49.939 |
| 0.9325694444444445 | 49.937 |
| 0.9325810185185185 | 49.935 |
| 0.9325925925925925 | 49.934 |
| 0.9326041666666667 | 49.935 |
| 0.9326157407407408 | 49.935 |
| 0.9326273148148148 | 49.935 |
| 0.9326388888888889 | 49.935 |
| 0.932650462962963 | 49.935 |
| 0.9326620370370371 | 49.934 |
| 0.932673611111111 | 49.933 |
| 0.9326851851851852 | 49.933 |
| 0.9326967592592593 | 49.933 |
| 0.9327083333333334 | 49.936 |
| 0.9327199074074074 | 49.94 |
| 0.9327314814814814 | 49.942 |
| 0.9327430555555556 | 49.945 |
| 0.9327546296296297 | 49.946 |
| 0.9327662037037037 | 49.946 |
| 0.9327777777777778 | 49.946 |
| 0.9327893518518519 | 49.942 |
| 0.9328009259259259 | 49.941 |
| 0.9328124999999999 | 49.94 |
| 0.9328240740740741 | 49.938 |
| 0.9328356481481482 | 49.938 |
| 0.9328472222222222 | 49.938 |
| 0.9328587962962963 | 49.939 |
| 0.9328703703703703 | 49.938 |
| 0.9328819444444445 | 49.938 |
| 0.9328935185185184 | 49.937 |
| 0.9329050925925926 | 49.939 |
| 0.9329166666666667 | 49.94 |
| 0.9329282407407408 | 49.944 |
| 0.9329398148148148 | 49.945 |
| 0.9329513888888888 | 49.95 |
| 0.932962962962963 | 49.951 |
| 0.9329745370370371 | 49.953 |
| 0.9329861111111111 | 49.954 |
| 0.9329976851851852 | 49.956 |
| 0.9330092592592593 | 49.957 |
| 0.9330208333333333 | 49.955 |
| 0.9330324074074073 | 49.951 |
| 0.9330439814814815 | 49.946 |
| 0.9330555555555556 | 49.942 |
| 0.9330671296296296 | 49.938 |
| 0.9330787037037037 | 49.935 |
| 0.9330902777777778 | 49.931 |
| 0.9331018518518519 | 49.927 |
| 0.9331134259259258 | 49.927 |
| 0.933125 | 49.928 |
| 0.9331365740740741 | 49.93 |
| 0.9331481481481482 | 49.931 |
| 0.9331597222222222 | 49.932 |
| 0.9331712962962962 | 49.931 |
| 0.9331828703703704 | 49.931 |
| 0.9331944444444445 | 49.929 |
| 0.9332060185185185 | 49.929 |
| 0.9332175925925926 | 49.929 |
| 0.9332291666666667 | 49.931 |
| 0.9332407407407407 | 49.932 |
| 0.9332523148148147 | 49.931 |
| 0.9332638888888889 | 49.928 |
| 0.933275462962963 | 49.927 |
| 0.933287037037037 | 49.927 |
| 0.9332986111111111 | 49.927 |
| 0.9333101851851852 | 49.93 |
| 0.9333217592592593 | 49.931 |
| 0.9333333333333332 | 49.931 |
| 0.9333449074074074 | 49.931 |
| 0.9333564814814815 | 49.93 |
| 0.9333680555555556 | 49.931 |
| 0.9333796296296296 | 49.93 |
| 0.9333912037037037 | 49.93 |
| 0.9334027777777778 | 49.93 |
| 0.933414351851852 | 49.931 |
| 0.9334259259259259 | 49.932 |
| 0.9334375 | 49.934 |
| 0.9334490740740741 | 49.934 |
| 0.9334606481481482 | 49.934 |
| 0.9334722222222221 | 49.933 |
| 0.9334837962962963 | 49.931 |
| 0.9334953703703704 | 49.93 |
| 0.9335069444444444 | 49.928 |
| 0.9335185185185185 | 49.925 |
| 0.9335300925925926 | 49.923 |
| 0.9335416666666667 | 49.924 |
| 0.9335532407407406 | 49.926 |
| 0.9335648148148148 | 49.928 |
| 0.9335763888888889 | 49.929 |
| 0.933587962962963 | 49.928 |
| 0.933599537037037 | 49.927 |
| 0.9336111111111111 | 49.927 |
| 0.9336226851851852 | 49.929 |
| 0.9336342592592594 | 49.931 |
| 0.9336458333333333 | 49.933 |
| 0.9336574074074074 | 49.937 |
| 0.9336689814814815 | 49.943 |
| 0.9336805555555556 | 49.947 |
| 0.9336921296296296 | 49.948 |
| 0.9337037037037037 | 49.944 |
| 0.9337152777777779 | 49.944 |
| 0.9337268518518518 | 49.944 |
| 0.9337384259259259 | 49.946 |
| 0.93375 | 49.947 |
| 0.9337615740740741 | 49.946 |
| 0.933773148148148 | 49.944 |
| 0.9337847222222222 | 49.942 |
| 0.9337962962962963 | 49.94 |
| 0.9338078703703704 | 49.938 |
| 0.9338194444444444 | 49.937 |
| 0.9338310185185185 | 49.935 |
| 0.9338425925925926 | 49.932 |
| 0.9338541666666668 | 49.93 |
| 0.9338657407407407 | 49.926 |
| 0.9338773148148148 | 49.924 |
| 0.9338888888888889 | 49.922 |
| 0.933900462962963 | 49.919 |
| 0.933912037037037 | 49.919 |
| 0.9339236111111111 | 49.92 |
| 0.9339351851851853 | 49.92 |
| 0.9339467592592593 | 49.92 |
| 0.9339583333333333 | 49.922 |
| 0.9339699074074074 | 49.925 |
| 0.9339814814814815 | 49.927 |
| 0.9339930555555555 | 49.931 |
| 0.9340046296296296 | 49.932 |
| 0.9340162037037038 | 49.934 |
| 0.9340277777777778 | 49.934 |
| 0.9340393518518518 | 49.934 |
| 0.9340509259259259 | 49.932 |
| 0.9340625 | 49.932 |
| 0.9340740740740742 | 49.932 |
| 0.9340856481481481 | 49.931 |
| 0.9340972222222222 | 49.93 |
| 0.9341087962962963 | 49.928 |
| 0.9341203703703704 | 49.927 |
| 0.9341319444444444 | 49.923 |
| 0.9341435185185185 | 49.922 |
| 0.9341550925925927 | 49.921 |
| 0.9341666666666667 | 49.918 |
| 0.9341782407407407 | 49.917 |
| 0.9341898148148148 | 49.916 |
| 0.9342013888888889 | 49.918 |
| 0.9342129629629629 | 49.921 |
| 0.934224537037037 | 49.923 |
| 0.9342361111111112 | 49.922 |
| 0.9342476851851852 | 49.925 |
| 0.9342592592592592 | 49.926 |
| 0.9342708333333333 | 49.928 |
| 0.9342824074074074 | 49.931 |
| 0.9342939814814816 | 49.934 |
| 0.9343055555555555 | 49.936 |
| 0.9343171296296297 | 49.939 |
| 0.9343287037037037 | 49.941 |
| 0.9343402777777778 | 49.944 |
| 0.9343518518518518 | 49.944 |
| 0.9343634259259259 | 49.946 |
| 0.9343750000000001 | 49.948 |
| 0.9343865740740741 | 49.95 |
| 0.9343981481481481 | 49.951 |
| 0.9344097222222222 | 49.952 |
| 0.9344212962962963 | 49.951 |
| 0.9344328703703703 | 49.946 |
| 0.9344444444444444 | 49.942 |
| 0.9344560185185186 | 49.934 |
| 0.9344675925925926 | 49.929 |
| 0.9344791666666666 | 49.927 |
| 0.9344907407407407 | 49.928 |
| 0.9345023148148148 | 49.929 |
| 0.934513888888889 | 49.931 |
| 0.9345254629629629 | 49.933 |
| 0.934537037037037 | 49.937 |
| 0.9345486111111111 | 49.94 |
| 0.9345601851851852 | 49.941 |
| 0.9345717592592592 | 49.941 |
| 0.9345833333333333 | 49.942 |
| 0.9345949074074075 | 49.943 |
| 0.9346064814814815 | 49.943 |
| 0.9346180555555555 | 49.946 |
| 0.9346296296296296 | 49.948 |
| 0.9346412037037037 | 49.947 |
| 0.9346527777777777 | 49.944 |
| 0.9346643518518518 | 49.941 |
| 0.934675925925926 | 49.937 |
| 0.9346875 | 49.933 |
| 0.934699074074074 | 49.931 |
| 0.9347106481481481 | 49.931 |
| 0.9347222222222222 | 49.93 |
| 0.9347337962962964 | 49.932 |
| 0.9347453703703703 | 49.935 |
| 0.9347569444444445 | 49.939 |
| 0.9347685185185185 | 49.94 |
| 0.9347800925925926 | 49.943 |
| 0.9347916666666666 | 49.945 |
| 0.9348032407407407 | 49.946 |
| 0.9348148148148149 | 49.947 |
| 0.9348263888888889 | 49.949 |
| 0.934837962962963 | 49.95 |
| 0.934849537037037 | 49.949 |
| 0.9348611111111111 | 49.948 |
| 0.9348726851851853 | 49.948 |
| 0.9348842592592592 | 49.949 |
| 0.9348958333333334 | 49.95 |
| 0.9349074074074074 | 49.952 |
| 0.9349189814814814 | 49.953 |
| 0.9349305555555555 | 49.954 |
| 0.9349421296296296 | 49.956 |
| 0.9349537037037038 | 49.956 |
| 0.9349652777777777 | 49.956 |
| 0.9349768518518519 | 49.957 |
| 0.9349884259259259 | 49.958 |
| 0.935 | 49.96 |
| 0.935011574074074 | 49.964 |
| 0.9350231481481481 | 49.969 |
| 0.9350347222222223 | 49.974 |
| 0.9350462962962963 | 49.977 |
| 0.9350578703703704 | 49.975 |
| 0.9350694444444444 | 49.974 |
| 0.9350810185185185 | 49.975 |
| 0.9350925925925927 | 49.976 |
| 0.9351041666666666 | 49.977 |
| 0.9351157407407408 | 49.979 |
| 0.9351273148148148 | 49.984 |
| 0.935138888888889 | 49.987 |
| 0.9351504629629629 | 49.988 |
| 0.935162037037037 | 49.989 |
| 0.9351736111111112 | 49.989 |
| 0.9351851851851851 | 49.988 |
| 0.9351967592592593 | 49.986 |
| 0.9352083333333333 | 49.985 |
| 0.9352199074074075 | 49.985 |
| 0.9352314814814814 | 49.985 |
| 0.9352430555555555 | 49.985 |
| 0.9352546296296297 | 49.984 |
| 0.9352662037037037 | 49.981 |
| 0.9352777777777778 | 49.978 |
| 0.9352893518518518 | 49.975 |
| 0.935300925925926 | 49.973 |
| 0.9353125000000001 | 49.971 |
| 0.935324074074074 | 49.971 |
| 0.9353356481481482 | 49.971 |
| 0.9353472222222222 | 49.971 |
| 0.9353587962962964 | 49.972 |
| 0.9353703703703703 | 49.973 |
| 0.9353819444444444 | 49.972 |
| 0.9353935185185186 | 49.969 |
| 0.9354050925925925 | 49.967 |
| 0.9354166666666667 | 49.965 |
| 0.9354282407407407 | 49.96 |
| 0.9354398148148149 | 49.957 |
| 0.9354513888888888 | 49.957 |
| 0.9354629629629629 | 49.959 |
| 0.9354745370370371 | 49.961 |
| 0.9354861111111111 | 49.962 |
| 0.9354976851851852 | 49.961 |
| 0.9355092592592592 | 49.96 |
| 0.9355208333333334 | 49.956 |
| 0.9355324074074075 | 49.954 |
| 0.9355439814814814 | 49.953 |
| 0.9355555555555556 | 49.953 |
| 0.9355671296296296 | 49.95 |
| 0.9355787037037038 | 49.948 |
| 0.9355902777777777 | 49.945 |
| 0.9356018518518519 | 49.946 |
| 0.935613425925926 | 49.949 |
| 0.9356249999999999 | 49.95 |
| 0.9356365740740741 | 49.951 |
| 0.9356481481481481 | 49.952 |
| 0.9356597222222223 | 49.954 |
| 0.9356712962962962 | 49.956 |
| 0.9356828703703703 | 49.957 |
| 0.9356944444444445 | 49.957 |
| 0.9357060185185185 | 49.957 |
| 0.9357175925925926 | 49.96 |
| 0.9357291666666666 | 49.962 |
| 0.9357407407407408 | 49.966 |
| 0.9357523148148149 | 49.97 |
| 0.9357638888888888 | 49.974 |
| 0.935775462962963 | 49.974 |
| 0.935787037037037 | 49.974 |
| 0.9357986111111112 | 49.974 |
| 0.9358101851851851 | 49.973 |
| 0.9358217592592593 | 49.97 |
| 0.9358333333333334 | 49.97 |
| 0.9358449074074073 | 49.969 |
| 0.9358564814814815 | 49.968 |
| 0.9358680555555555 | 49.969 |
| 0.9358796296296297 | 49.97 |
| 0.9358912037037036 | 49.967 |
| 0.9359027777777778 | 49.969 |
| 0.9359143518518519 | 49.968 |
| 0.9359259259259259 | 49.97 |
| 0.9359375 | 49.973 |
| 0.935949074074074 | 49.977 |
| 0.9359606481481482 | 49.98 |
| 0.9359722222222223 | 49.983 |
| 0.9359837962962962 | 49.983 |
| 0.9359953703703704 | 49.988 |
| 0.9360069444444444 | 49.99 |
| 0.9360185185185186 | 49.99 |
| 0.9360300925925925 | 49.99 |
| 0.9360416666666667 | 49.988 |
| 0.9360532407407408 | 49.988 |
| 0.9360648148148148 | 49.985 |
| 0.9360763888888889 | 49.982 |
| 0.9360879629629629 | 49.976 |
| 0.9360995370370371 | 49.971 |
| 0.936111111111111 | 49.969 |
| 0.9361226851851852 | 49.967 |
| 0.9361342592592593 | 49.965 |
| 0.9361458333333333 | 49.965 |
| 0.9361574074074074 | 49.966 |
| 0.9361689814814814 | 49.969 |
| 0.9361805555555556 | 49.97 |
| 0.9361921296296297 | 49.974 |
| 0.9362037037037036 | 49.977 |
| 0.9362152777777778 | 49.981 |
| 0.9362268518518518 | 49.985 |
| 0.936238425925926 | 49.987 |
| 0.9362499999999999 | 49.988 |
| 0.9362615740740741 | 49.989 |
| 0.9362731481481482 | 49.989 |
| 0.9362847222222223 | 49.987 |
| 0.9362962962962963 | 49.986 |
| 0.9363078703703703 | 49.984 |
| 0.9363194444444445 | 49.983 |
| 0.9363310185185184 | 49.981 |
| 0.9363425925925926 | 49.982 |
| 0.9363541666666667 | 49.981 |
| 0.9363657407407407 | 49.98 |
| 0.9363773148148148 | 49.981 |
| 0.9363888888888888 | 49.983 |
| 0.936400462962963 | 49.985 |
| 0.9364120370370371 | 49.986 |
| 0.936423611111111 | 49.984 |
| 0.9364351851851852 | 49.984 |
| 0.9364467592592592 | 49.982 |
| 0.9364583333333334 | 49.98 |
| 0.9364699074074073 | 49.979 |
| 0.9364814814814815 | 49.977 |
| 0.9364930555555556 | 49.978 |
| 0.9365046296296297 | 49.979 |
| 0.9365162037037037 | 49.98 |
| 0.9365277777777777 | 49.98 |
| 0.9365393518518519 | 49.981 |
| 0.936550925925926 | 49.983 |
| 0.9365625 | 49.984 |
| 0.9365740740740741 | 49.984 |
| 0.9365856481481482 | 49.985 |
| 0.9365972222222222 | 49.982 |
| 0.9366087962962962 | 49.983 |
| 0.9366203703703704 | 49.986 |
| 0.9366319444444445 | 49.986 |
| 0.9366435185185185 | 49.988 |
| 0.9366550925925926 | 49.991 |
| 0.9366666666666666 | 49.995 |
| 0.9366782407407408 | 50.002 |
| 0.9366898148148147 | 50.008 |
| 0.9367013888888889 | 50.012 |
| 0.936712962962963 | 50.014 |
| 0.9367245370370371 | 50.013 |
| 0.9367361111111111 | 50.013 |
| 0.9367476851851851 | 50.015 |
| 0.9367592592592593 | 50.017 |
| 0.9367708333333334 | 50.018 |
| 0.9367824074074074 | 50.018 |
| 0.9367939814814815 | 50.019 |